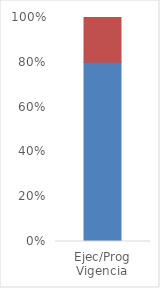
| Category | Series 0 | Series 1 |
|---|---|---|
| Ejec/Prog
Vigencia | 1 | 0.25 |